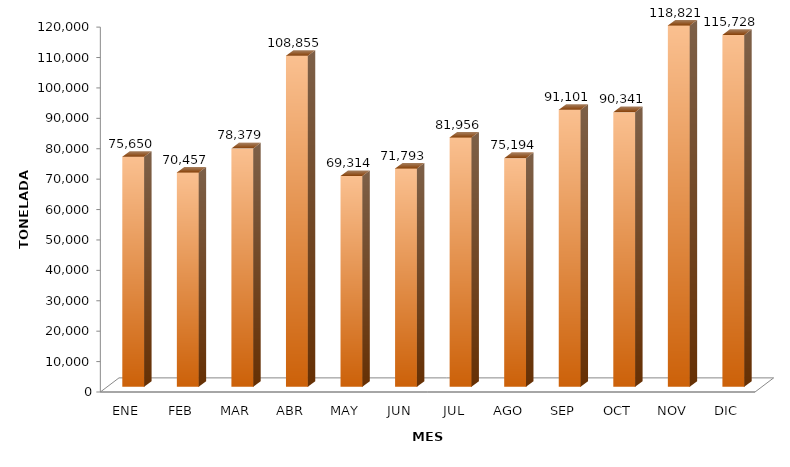
| Category | Series 0 |
|---|---|
| ENE | 75649.815 |
| FEB | 70457.167 |
| MAR | 78379.148 |
| ABR | 108855.332 |
| MAY | 69313.962 |
| JUN | 71793.103 |
| JUL | 81955.609 |
| AGO | 75193.771 |
| SEP | 91101.459 |
| OCT | 90340.878 |
| NOV | 118821.433 |
| DIC | 115728.321 |